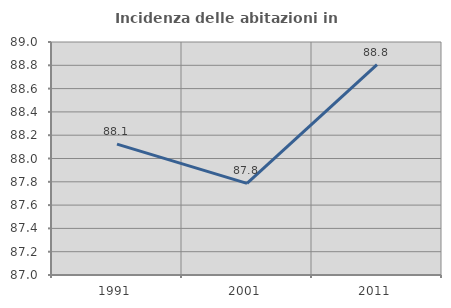
| Category | Incidenza delle abitazioni in proprietà  |
|---|---|
| 1991.0 | 88.124 |
| 2001.0 | 87.787 |
| 2011.0 | 88.807 |